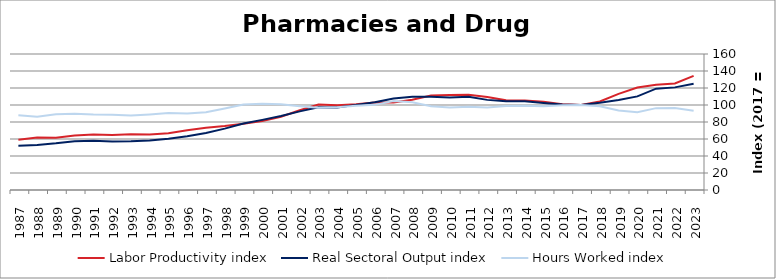
| Category | Labor Productivity index | Real Sectoral Output index | Hours Worked index |
|---|---|---|---|
| 2023.0 | 134.207 | 125.089 | 93.206 |
| 2022.0 | 125.237 | 120.737 | 96.407 |
| 2021.0 | 123.75 | 119.181 | 96.308 |
| 2020.0 | 120.558 | 110.137 | 91.356 |
| 2019.0 | 113.121 | 105.904 | 93.62 |
| 2018.0 | 104.16 | 102.574 | 98.478 |
| 2017.0 | 100 | 100 | 100 |
| 2016.0 | 100.986 | 100.605 | 99.623 |
| 2015.0 | 103.948 | 102.338 | 98.452 |
| 2014.0 | 105.364 | 104.435 | 99.118 |
| 2013.0 | 105.692 | 104.558 | 98.928 |
| 2012.0 | 109.379 | 106.03 | 96.938 |
| 2011.0 | 112.137 | 109.71 | 97.835 |
| 2010.0 | 111.887 | 108.711 | 97.162 |
| 2009.0 | 111.288 | 109.572 | 98.459 |
| 2008.0 | 106.208 | 109.697 | 103.285 |
| 2007.0 | 102.932 | 107.667 | 104.601 |
| 2006.0 | 103.036 | 103.195 | 100.155 |
| 2005.0 | 100.969 | 100.138 | 99.177 |
| 2004.0 | 99.78 | 97.092 | 97.306 |
| 2003.0 | 100.629 | 97.301 | 96.692 |
| 2002.0 | 93.813 | 92.509 | 98.61 |
| 2001.0 | 86.122 | 86.973 | 100.988 |
| 2000.0 | 81.261 | 82.488 | 101.51 |
| 1999.0 | 77.927 | 78.326 | 100.512 |
| 1998.0 | 75.185 | 72.174 | 95.995 |
| 1997.0 | 73.18 | 67.021 | 91.584 |
| 1996.0 | 70.299 | 63.198 | 89.899 |
| 1995.0 | 66.685 | 60.32 | 90.454 |
| 1994.0 | 65.413 | 58.132 | 88.869 |
| 1993.0 | 65.6 | 57.419 | 87.529 |
| 1992.0 | 64.631 | 57.201 | 88.503 |
| 1991.0 | 65.248 | 57.942 | 88.802 |
| 1990.0 | 64.022 | 57.484 | 89.789 |
| 1989.0 | 61.485 | 54.869 | 89.24 |
| 1988.0 | 61.658 | 53.072 | 86.075 |
| 1987.0 | 59.232 | 52.079 | 87.924 |